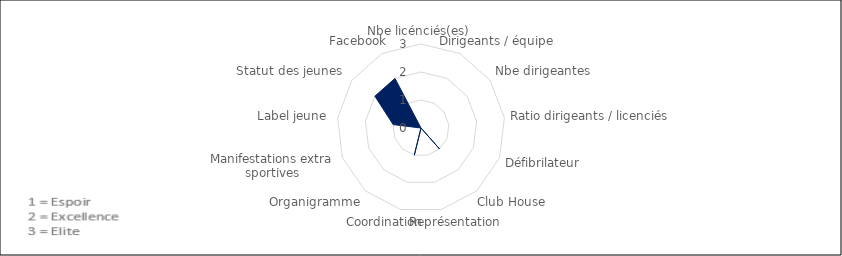
| Category | Series 0 |
|---|---|
| Nbe licénciés(es) | 0 |
| Dirigeants / équipe | 0 |
| Nbe dirigeantes | 0 |
| Ratio dirigeants / licenciés | 0 |
| Défibrilateur | 0 |
| Club House | 1 |
| Représentation | 0 |
| Coordination | 1 |
| Organigramme | 0 |
| Manifestations extra sportives | 0 |
| Label jeune | 1 |
| Statut des jeunes | 2 |
| Facebook | 2 |